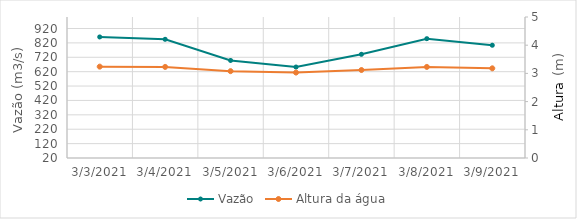
| Category | Vazão |
|---|---|
| 2/2/21 | 783.67 |
| 2/1/21 | 673.75 |
| 1/31/21 | 550.88 |
| 1/30/21 | 530.32 |
| 1/29/21 | 498.51 |
| 1/28/21 | 453.72 |
| 1/27/21 | 456.19 |